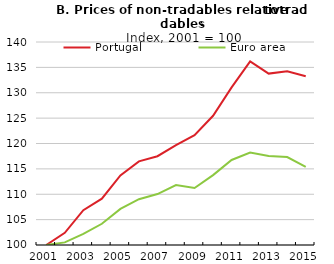
| Category | Portugal | Euro area |
|---|---|---|
| 2001.0 | 100 | 100 |
| 2002.0 | 102.393 | 100.514 |
| 2003.0 | 106.854 | 102.191 |
| 2004.0 | 109.135 | 104.18 |
| 2005.0 | 113.714 | 107.123 |
| 2006.0 | 116.476 | 109.024 |
| 2007.0 | 117.494 | 110.039 |
| 2008.0 | 119.689 | 111.811 |
| 2009.0 | 121.645 | 111.237 |
| 2010.0 | 125.462 | 113.776 |
| 2011.0 | 131.06 | 116.759 |
| 2012.0 | 136.194 | 118.204 |
| 2013.0 | 133.77 | 117.54 |
| 2014.0 | 134.242 | 117.326 |
| 2015.0 | 133.251 | 115.396 |